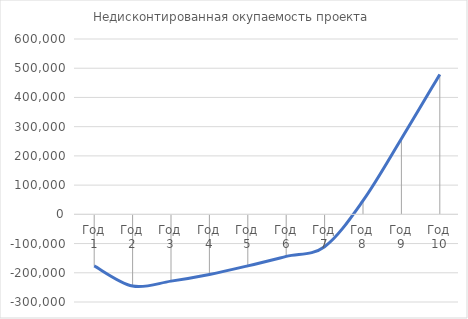
| Category | Недисконтированная окупаемость проекта |
|---|---|
| Год 1 | -176400 |
| Год 2 | -245451.411 |
| Год 3 | -228598.028 |
| Год 4 | -205681.547 |
| Год 5 | -176290.935 |
| Год 6 | -143987.386 |
| Год 7 | -110682.416 |
| Год 8 | 46623.714 |
| Год 9 | 258537.612 |
| Год 10 | 478800.52 |